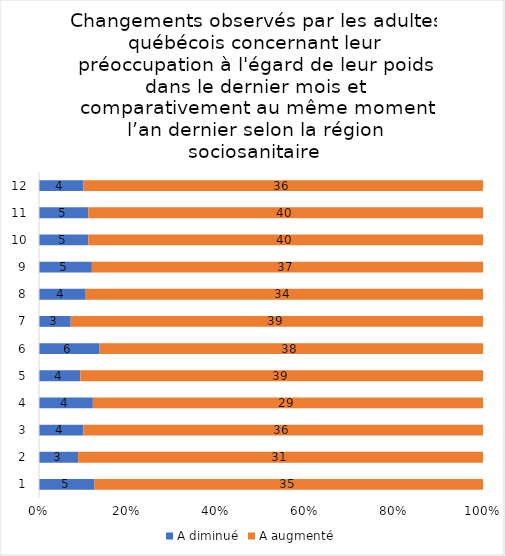
| Category | A diminué | A augmenté |
|---|---|---|
| 0 | 5 | 35 |
| 1 | 3 | 31 |
| 2 | 4 | 36 |
| 3 | 4 | 29 |
| 4 | 4 | 39 |
| 5 | 6 | 38 |
| 6 | 3 | 39 |
| 7 | 4 | 34 |
| 8 | 5 | 37 |
| 9 | 5 | 40 |
| 10 | 5 | 40 |
| 11 | 4 | 36 |